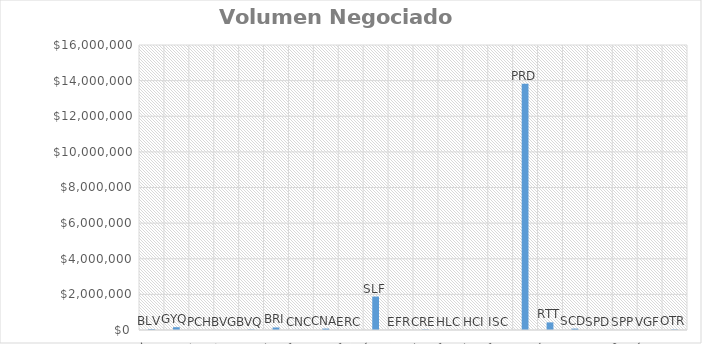
| Category | Volumen (USD) |
|---|---|
| BLV | 49950 |
| GYQ | 156784.31 |
| PCH | 1738 |
| BVG | 1370.4 |
| BVQ | 25615.48 |
| BRI | 142000 |
| CNC | 4058.8 |
| CNA | 78838 |
| ERC | 0 |
| SLF | 1878586.06 |
| EFR | 0 |
| CRE | 23272.75 |
| HLC | 0 |
| HCI | 0 |
| ISC | 431.2 |
| PRD | 13828204.75 |
| RTT | 427205.72 |
| SCD | 78264.55 |
| SPD | 0 |
| SPP | 2890 |
| VGF | 0 |
| OTR | 29282.8 |